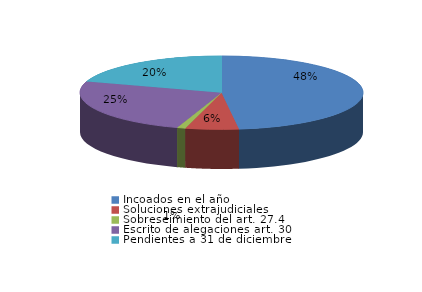
| Category | Series 0 |
|---|---|
| Incoados en el año | 404 |
| Soluciones extrajudiciales | 51 |
| Sobreseimiento del art. 27.4 | 8 |
| Escrito de alegaciones art. 30 | 209 |
| Pendientes a 31 de diciembre | 169 |